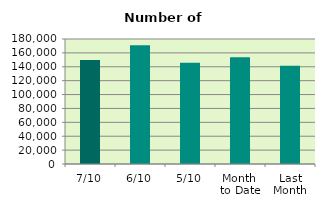
| Category | Series 0 |
|---|---|
| 7/10 | 149648 |
| 6/10 | 171018 |
| 5/10 | 145924 |
| Month 
to Date | 153704.4 |
| Last
Month | 141428.727 |